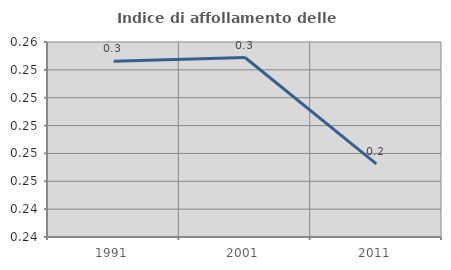
| Category | Indice di affollamento delle abitazioni  |
|---|---|
| 1991.0 | 0.255 |
| 2001.0 | 0.255 |
| 2011.0 | 0.247 |